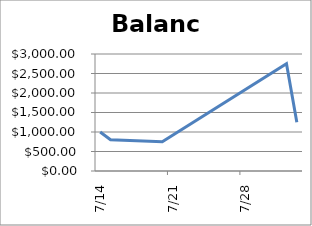
| Category | Balance |
|---|---|
| 2010-07-14 | 1000 |
| 2010-07-15 | 800 |
| 2010-07-20 | 750 |
| 2010-08-01 | 2750 |
| 2010-08-02 | 1250 |